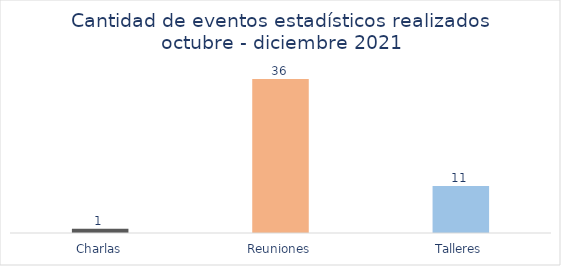
| Category | Series 0 |
|---|---|
| Charlas | 1 |
| Reuniones | 36 |
| Talleres | 11 |